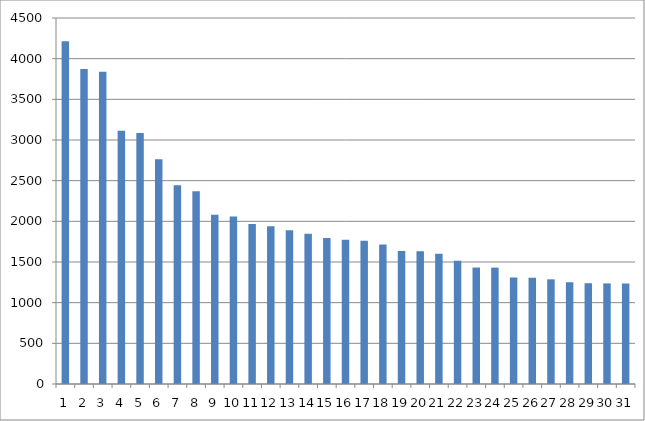
| Category | Series 0 |
|---|---|
| 0 | 4213 |
| 1 | 3874 |
| 2 | 3839 |
| 3 | 3115 |
| 4 | 3086 |
| 5 | 2762 |
| 6 | 2445 |
| 7 | 2370 |
| 8 | 2082 |
| 9 | 2060 |
| 10 | 1967 |
| 11 | 1940 |
| 12 | 1891 |
| 13 | 1847 |
| 14 | 1794 |
| 15 | 1774 |
| 16 | 1761 |
| 17 | 1715 |
| 18 | 1634 |
| 19 | 1631 |
| 20 | 1600 |
| 21 | 1515 |
| 22 | 1432 |
| 23 | 1431 |
| 24 | 1309 |
| 25 | 1305 |
| 26 | 1287 |
| 27 | 1251 |
| 28 | 1239 |
| 29 | 1237 |
| 30 | 1237 |